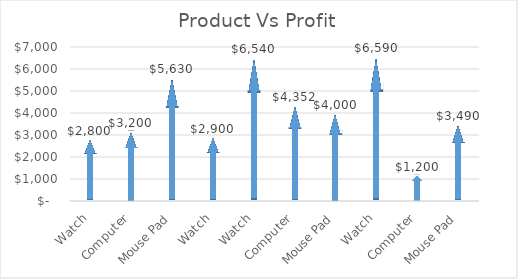
| Category | Series 0 |
|---|---|
| Watch | 2800 |
| Computer | 3200 |
| Mouse Pad | 5630 |
| Watch | 2900 |
| Watch | 6540 |
| Computer | 4352 |
| Mouse Pad | 4000 |
| Watch | 6590 |
| Computer | 1200 |
| Mouse Pad | 3490 |